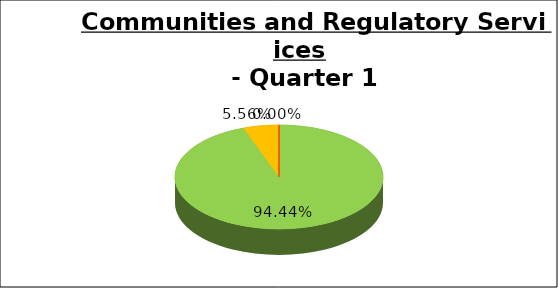
| Category | Q1 |
|---|---|
| Green | 0.944 |
| Amber | 0.056 |
| Red | 0 |